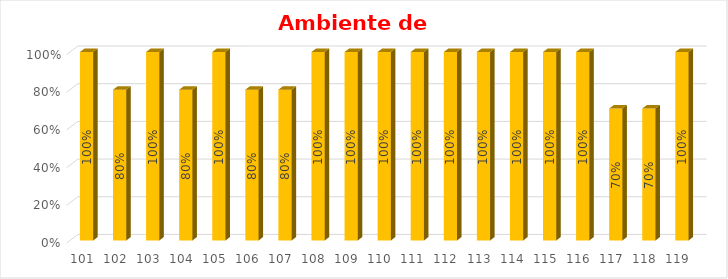
| Category | % Avance |
|---|---|
| 101.0 | 1 |
| 102.0 | 0.8 |
| 103.0 | 1 |
| 104.0 | 0.8 |
| 105.0 | 1 |
| 106.0 | 0.8 |
| 107.0 | 0.8 |
| 108.0 | 1 |
| 109.0 | 1 |
| 110.0 | 1 |
| 111.0 | 1 |
| 112.0 | 1 |
| 113.0 | 1 |
| 114.0 | 1 |
| 115.0 | 1 |
| 116.0 | 1 |
| 117.0 | 0.7 |
| 118.0 | 0.7 |
| 119.0 | 1 |